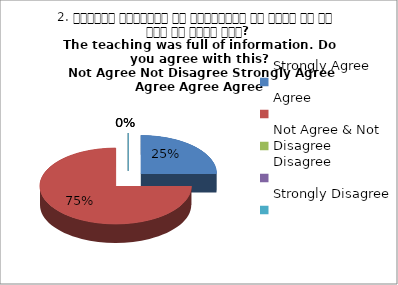
| Category | 2. शिक्षण जानकारी से परिपूर्ण था क्या आप इस बात से सहमत हैं?
The teaching was full of information. Do you agree with this?
 Not Agree Not Disagree Strongly Agree Agree Agree Agree |
|---|---|
| Strongly Agree | 1 |
| Agree | 3 |
| Not Agree & Not Disagree | 0 |
| Disagree | 0 |
| Strongly Disagree | 0 |